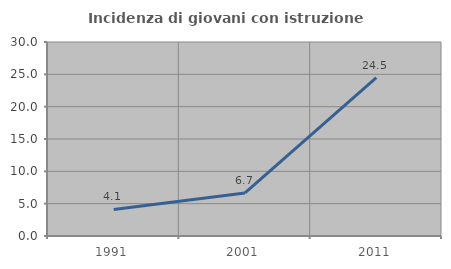
| Category | Incidenza di giovani con istruzione universitaria |
|---|---|
| 1991.0 | 4.11 |
| 2001.0 | 6.667 |
| 2011.0 | 24.49 |